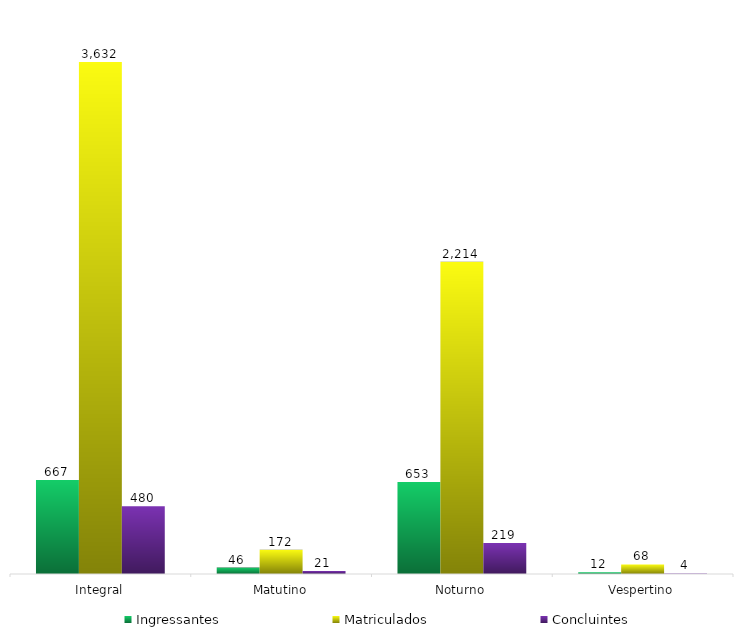
| Category | Ingressantes | Matriculados | Concluintes |
|---|---|---|---|
| 0 | 667 | 3632 | 480 |
| 1 | 46 | 172 | 21 |
| 2 | 653 | 2214 | 219 |
| 3 | 12 | 68 | 4 |